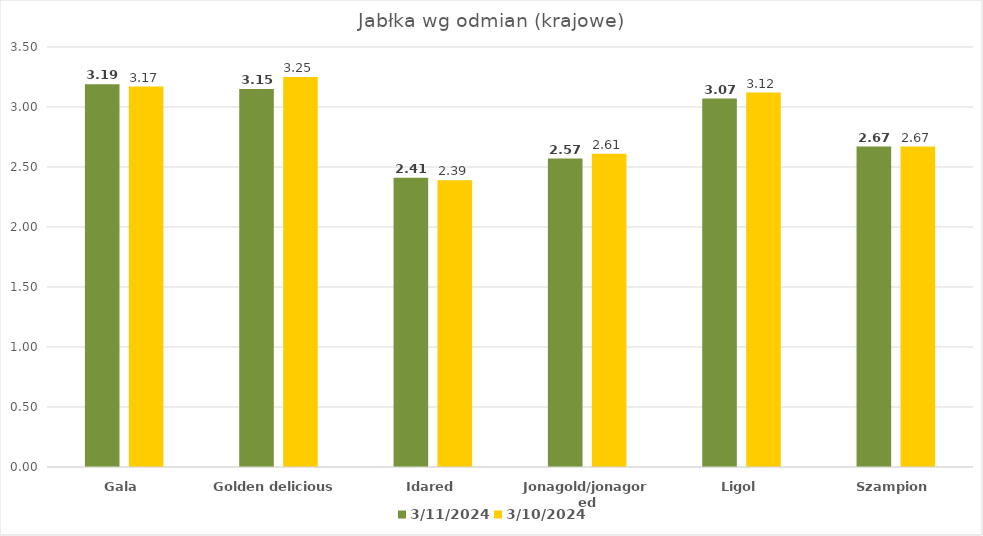
| Category | 2024-03-11 | 2024-03-10 |
|---|---|---|
| Gala | 3.19 | 3.17 |
| Golden delicious | 3.15 | 3.25 |
| Idared | 2.41 | 2.39 |
| Jonagold/jonagored | 2.57 | 2.61 |
| Ligol | 3.07 | 3.12 |
| Szampion | 2.67 | 2.67 |